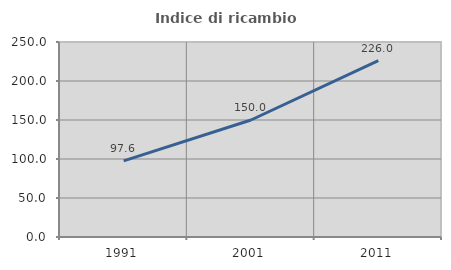
| Category | Indice di ricambio occupazionale  |
|---|---|
| 1991.0 | 97.647 |
| 2001.0 | 150 |
| 2011.0 | 225.993 |